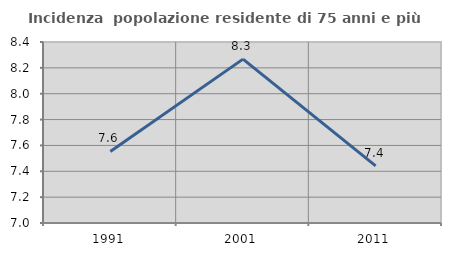
| Category | Incidenza  popolazione residente di 75 anni e più |
|---|---|
| 1991.0 | 7.553 |
| 2001.0 | 8.267 |
| 2011.0 | 7.441 |